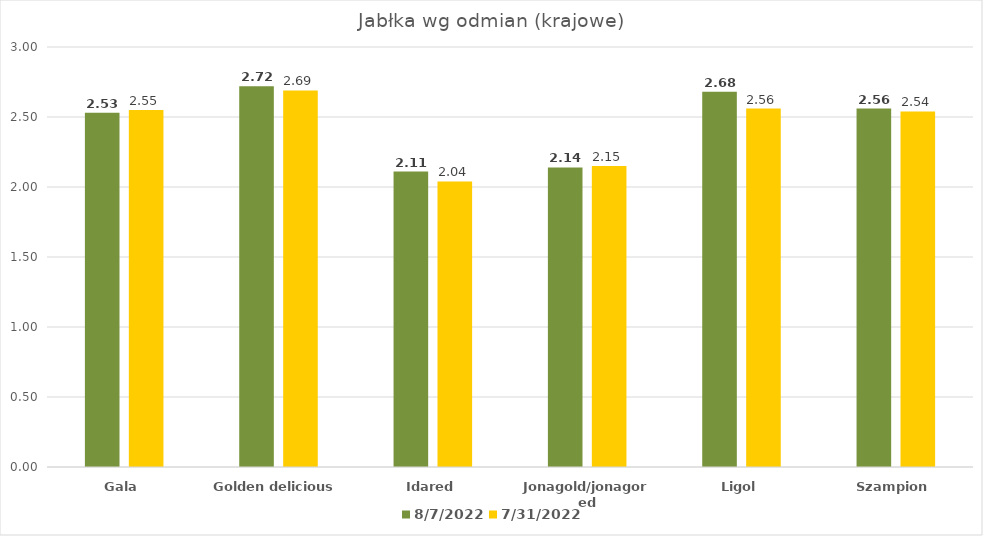
| Category | 2022-08-07 | 2022-07-31 |
|---|---|---|
| Gala | 2.53 | 2.55 |
| Golden delicious | 2.72 | 2.69 |
| Idared | 2.11 | 2.04 |
| Jonagold/jonagored | 2.14 | 2.15 |
| Ligol | 2.68 | 2.56 |
| Szampion | 2.56 | 2.54 |